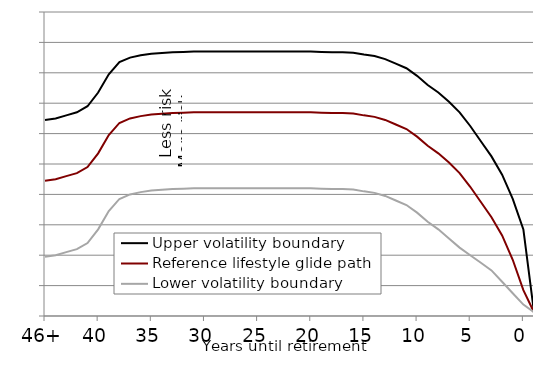
| Category | Upper volatility boundary | Reference lifestyle glide path | Lower volatility boundary |
|---|---|---|---|
| 46+ | 12.9 | 8.9 | 3.9 |
| 44 | 13 | 9 | 4 |
| 43 | 13.2 | 9.2 | 4.2 |
| 42 | 13.4 | 9.4 | 4.4 |
| 41 | 13.8 | 9.8 | 4.8 |
| 40 | 14.7 | 10.7 | 5.7 |
| 39 | 15.9 | 11.9 | 6.9 |
| 38 | 16.7 | 12.7 | 7.7 |
| 37 | 17 | 13 | 8 |
| 36 | 17.15 | 13.15 | 8.15 |
| 35 | 17.25 | 13.25 | 8.25 |
| 34 | 17.3 | 13.3 | 8.3 |
| 33 | 17.35 | 13.35 | 8.35 |
| 32 | 17.375 | 13.375 | 8.375 |
| 31 | 17.4 | 13.4 | 8.4 |
| 30 | 17.4 | 13.4 | 8.4 |
| 29 | 17.4 | 13.4 | 8.4 |
| 28 | 17.4 | 13.4 | 8.4 |
| 27 | 17.4 | 13.4 | 8.4 |
| 26 | 17.4 | 13.4 | 8.4 |
| 25 | 17.4 | 13.4 | 8.4 |
| 24 | 17.4 | 13.4 | 8.4 |
| 23 | 17.4 | 13.4 | 8.4 |
| 22 | 17.4 | 13.4 | 8.4 |
| 21 | 17.4 | 13.4 | 8.4 |
| 20 | 17.4 | 13.4 | 8.4 |
| 19 | 17.375 | 13.375 | 8.375 |
| 18 | 17.35 | 13.35 | 8.35 |
| 17 | 17.35 | 13.35 | 8.35 |
| 16 | 17.325 | 13.325 | 8.325 |
| 15 | 17.2 | 13.2 | 8.2 |
| 14 | 17.1 | 13.1 | 8.1 |
| 13 | 16.9 | 12.9 | 7.9 |
| 12 | 16.6 | 12.6 | 7.6 |
| 11 | 16.3 | 12.3 | 7.3 |
| 10 | 15.8 | 11.8 | 6.8 |
| 9 | 15.2 | 11.2 | 6.2 |
| 8 | 14.7 | 10.7 | 5.7 |
| 7 | 14.1 | 10.1 | 5.1 |
| 6 | 13.4 | 9.4 | 4.5 |
| 5 | 12.5 | 8.5 | 4 |
| 4 | 11.5 | 7.5 | 3.5 |
| 3 | 10.5 | 6.5 | 3 |
| 2 | 9.3 | 5.3 | 2.25 |
| 1 | 7.7 | 3.7 | 1.5 |
| 0 | 5.7 | 1.7 | 0.75 |